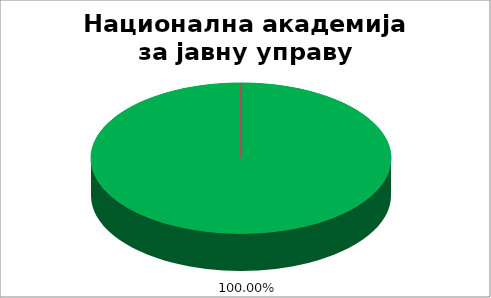
| Category | Национална академија за јавну управу |
|---|---|
| 0 | 1 |
| 1 | 0 |
| 2 | 0 |
| 3 | 0 |
| 4 | 0 |